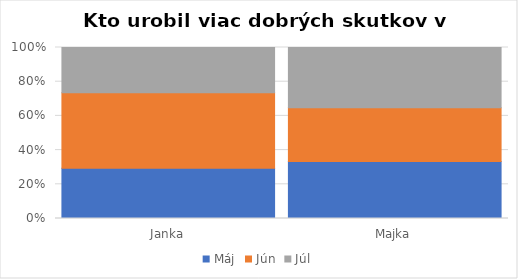
| Category | Máj | Jún | Júl |
|---|---|---|---|
| Janka | 10 | 15 | 9 |
| Majka | 17 | 16 | 18 |